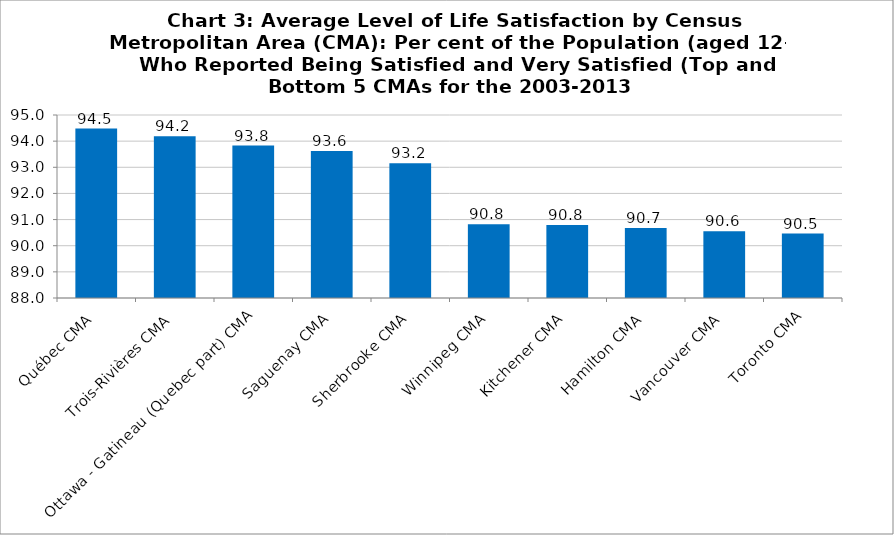
| Category | Series 0 | Series 1 | Series 2 | Series 3 | Series 4 | Series 5 | Series 6 | Series 7 | Series 8 | Series 9 |
|---|---|---|---|---|---|---|---|---|---|---|
| Québec CMA |  |  |  |  |  |  |  |  |  | 94.481 |
| Trois-Rivières CMA |  |  |  |  |  |  |  |  |  | 94.189 |
| Ottawa - Gatineau (Quebec part) CMA |  |  |  |  |  |  |  |  |  | 93.833 |
| Saguenay CMA |  |  |  |  |  |  |  |  |  | 93.622 |
| Sherbrooke CMA |  |  |  |  |  |  |  |  |  | 93.156 |
| Winnipeg CMA |  |  |  |  |  |  |  |  |  | 90.822 |
| Kitchener CMA |  |  |  |  |  |  |  |  |  | 90.789 |
| Hamilton CMA |  |  |  |  |  |  |  |  |  | 90.678 |
| Vancouver CMA |  |  |  |  |  |  |  |  |  | 90.556 |
| Toronto CMA |  |  |  |  |  |  |  |  |  | 90.467 |